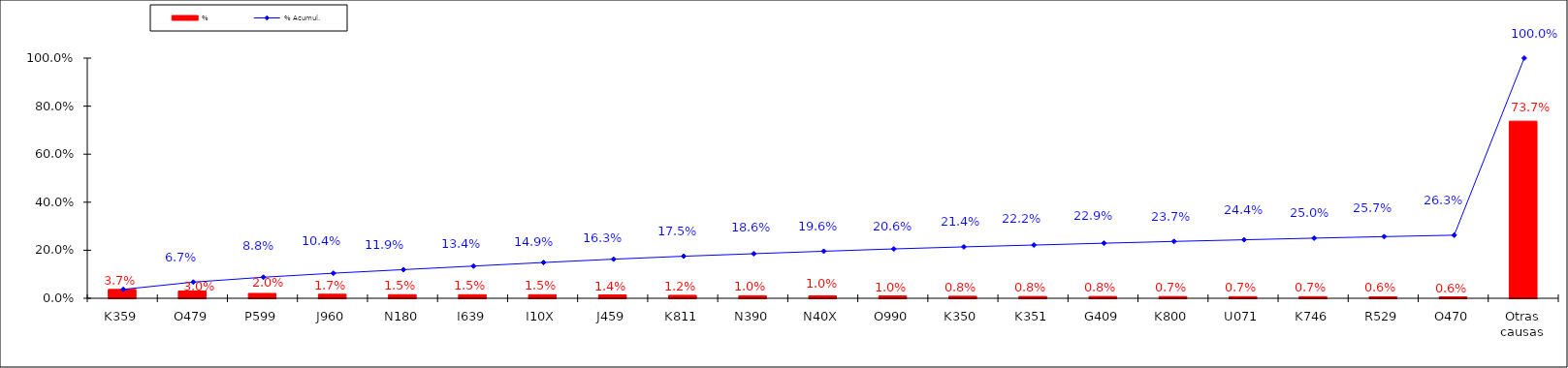
| Category | % |
|---|---|
| K359 | 0.037 |
| O479 | 0.03 |
| P599 | 0.02 |
| J960 | 0.017 |
| N180 | 0.015 |
| I639 | 0.015 |
| I10X | 0.015 |
| J459 | 0.014 |
| K811 | 0.012 |
| N390 | 0.01 |
| N40X | 0.01 |
| O990 | 0.01 |
| K350 | 0.008 |
| K351 | 0.008 |
| G409 | 0.008 |
| K800 | 0.007 |
| U071 | 0.007 |
| K746 | 0.007 |
| R529 | 0.006 |
| O470 | 0.006 |
| Otras causas | 0.737 |